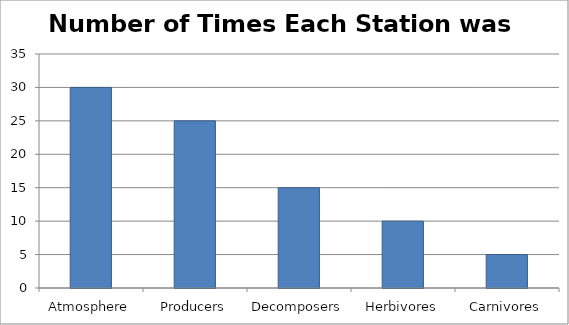
| Category | Series 0 |
|---|---|
| Atmosphere | 30 |
| Producers | 25 |
| Decomposers | 15 |
| Herbivores | 10 |
| Carnivores | 5 |